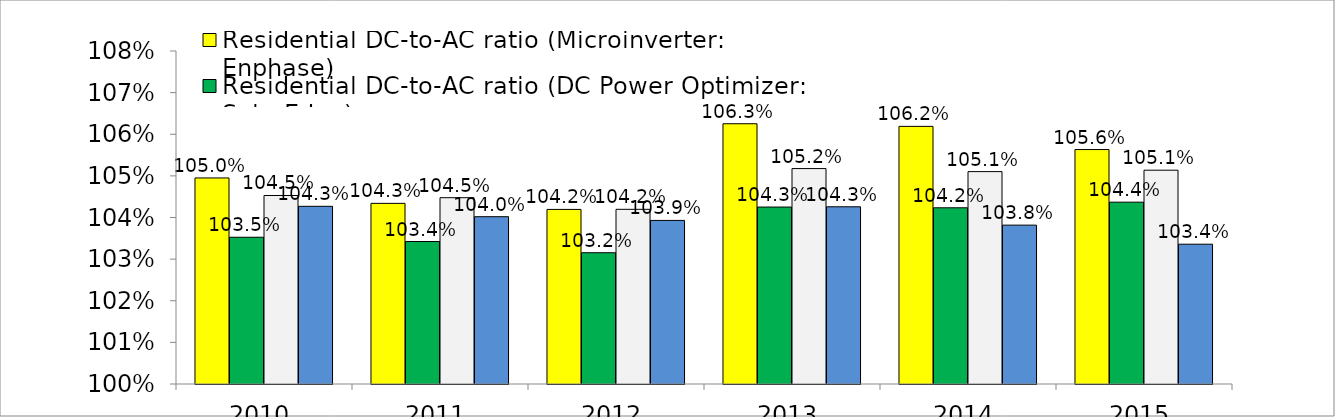
| Category | Residential DC-to-AC ratio (Microinverter: Enphase)  | Residential DC-to-AC ratio (DC Power Optimizer: SolarEdge) | Residential DC-to-AC ratio (String Inverter: Others) | Non-Residential DC-to-AC ratio (All Together) |
|---|---|---|---|---|
| 2010.0 | 1.05 | 1.035 | 1.045 | 1.043 |
| 2011.0 | 1.043 | 1.034 | 1.045 | 1.04 |
| 2012.0 | 1.042 | 1.032 | 1.042 | 1.039 |
| 2013.0 | 1.063 | 1.043 | 1.052 | 1.043 |
| 2014.0 | 1.062 | 1.042 | 1.051 | 1.038 |
| 2015.0 | 1.056 | 1.044 | 1.051 | 1.034 |